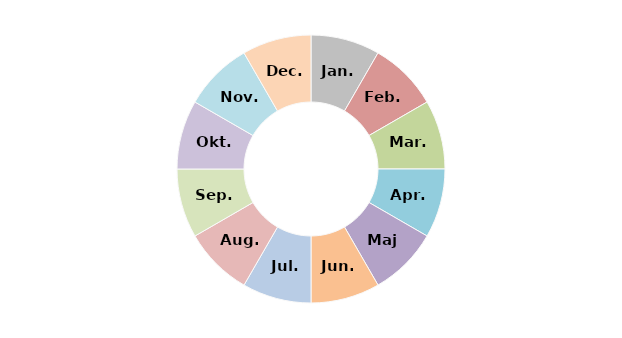
| Category | Series 0 |
|---|---|
| Jan. | 40 |
| Feb. | 40 |
| Mar. | 40 |
| Apr. | 40 |
| Maj | 40 |
| Jun. | 40 |
| Jul. | 40 |
| Aug. | 40 |
| Sep. | 40 |
| Okt. | 40 |
| Nov. | 40 |
| Dec. | 40 |